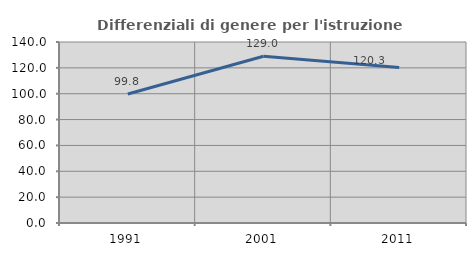
| Category | Differenziali di genere per l'istruzione superiore |
|---|---|
| 1991.0 | 99.75 |
| 2001.0 | 129.007 |
| 2011.0 | 120.341 |